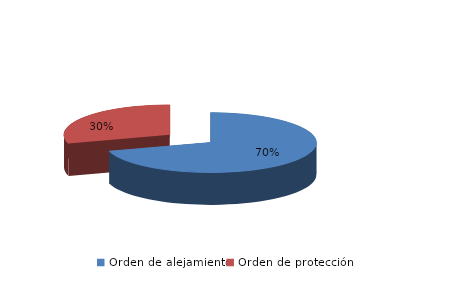
| Category | Series 0 |
|---|---|
| Orden de alejamiento | 161 |
| Orden de protección | 68 |